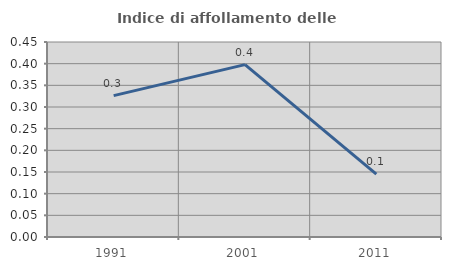
| Category | Indice di affollamento delle abitazioni  |
|---|---|
| 1991.0 | 0.326 |
| 2001.0 | 0.398 |
| 2011.0 | 0.145 |